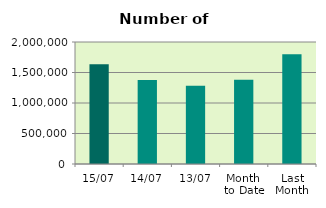
| Category | Series 0 |
|---|---|
| 15/07 | 1635892 |
| 14/07 | 1377988 |
| 13/07 | 1281556 |
| Month 
to Date | 1381663.273 |
| Last
Month | 1799892.818 |